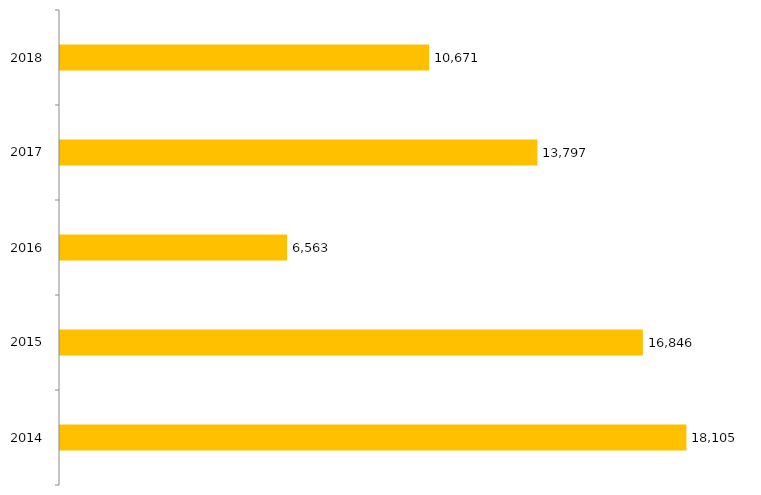
| Category | Inscritos |
|---|---|
| 2014.0 | 18105 |
| 2015.0 | 16846 |
| 2016.0 | 6563 |
| 2017.0 | 13797 |
| 2018.0 | 10671 |